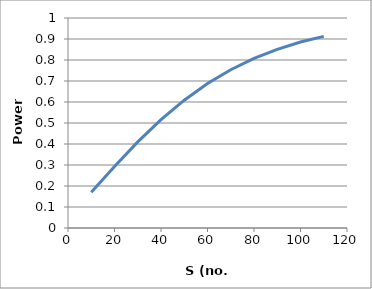
| Category | Series 0 |
|---|---|
| 10.0 | 0.17 |
| 20.0 | 0.293 |
| 30.0 | 0.41 |
| 40.0 | 0.516 |
| 50.0 | 0.609 |
| 60.0 | 0.688 |
| 70.0 | 0.754 |
| 80.0 | 0.807 |
| 90.0 | 0.851 |
| 100.0 | 0.885 |
| 110.0 | 0.913 |